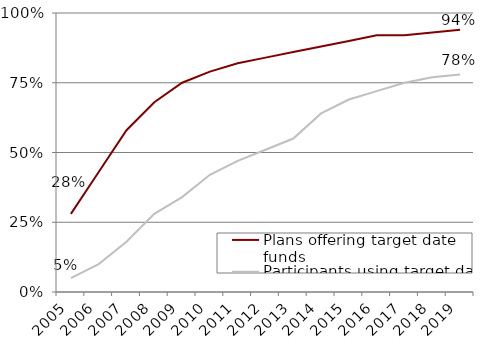
| Category | Plans offering target date funds | Participants using target date funds |
|---|---|---|
| 2005.0 | 0.28 | 0.05 |
| 2006.0 | 0.43 | 0.1 |
| 2007.0 | 0.58 | 0.18 |
| 2008.0 | 0.68 | 0.28 |
| 2009.0 | 0.75 | 0.34 |
| 2010.0 | 0.79 | 0.42 |
| 2011.0 | 0.82 | 0.47 |
| 2012.0 | 0.84 | 0.51 |
| 2013.0 | 0.86 | 0.55 |
| 2014.0 | 0.88 | 0.64 |
| 2015.0 | 0.9 | 0.69 |
| 2016.0 | 0.92 | 0.72 |
| 2017.0 | 0.92 | 0.75 |
| 2018.0 | 0.93 | 0.77 |
| 2019.0 | 0.94 | 0.78 |